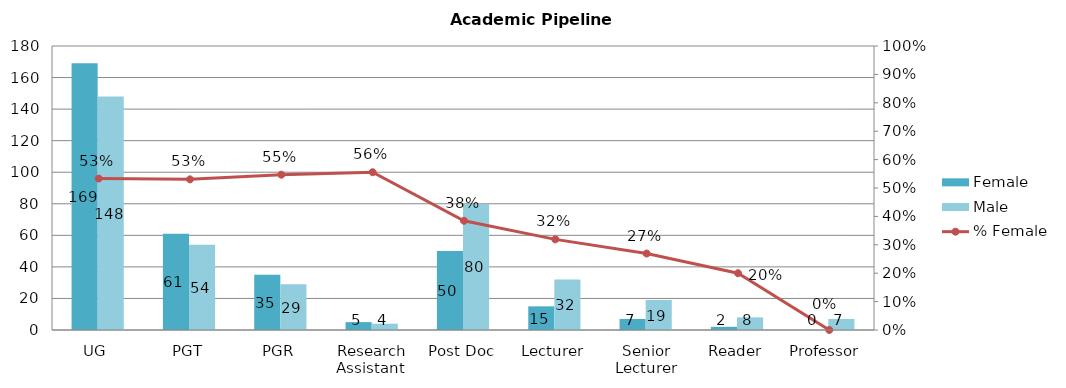
| Category | Female | Male |
|---|---|---|
| UG | 169 | 148 |
| PGT | 61 | 54 |
| PGR | 35 | 29 |
| Research Assistant  | 5 | 4 |
| Post Doc | 50 | 80 |
| Lecturer | 15 | 32 |
| Senior Lecturer | 7 | 19 |
| Reader | 2 | 8 |
| Professor  | 0 | 7 |